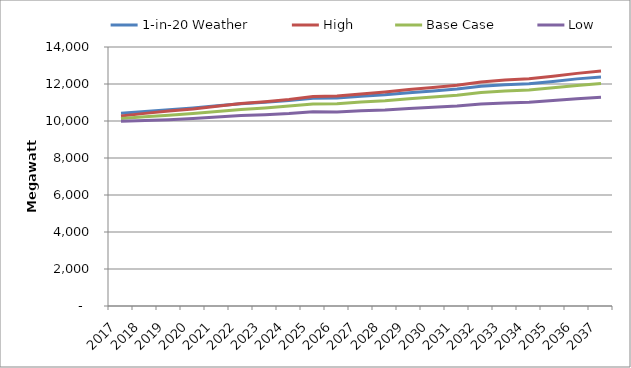
| Category | 1-in-20 Weather | High | Base Case | Low |
|---|---|---|---|---|
| 2017.0 | 10418.772 | 10272.582 | 10129.885 | 9982.24 |
| 2018.0 | 10517.176 | 10412.024 | 10224.713 | 10028.541 |
| 2019.0 | 10605.92 | 10535.82 | 10310.015 | 10069.2 |
| 2020.0 | 10701.734 | 10650.878 | 10403.218 | 10136.416 |
| 2021.0 | 10822.358 | 10799.633 | 10518.418 | 10213.835 |
| 2022.0 | 10930.974 | 10942.516 | 10624.16 | 10291.374 |
| 2023.0 | 11013.038 | 11042.635 | 10706.388 | 10341.916 |
| 2024.0 | 11113.74 | 11164.253 | 10804.439 | 10400.315 |
| 2025.0 | 11231.57 | 11322.64 | 10919.631 | 10494.272 |
| 2026.0 | 11246.189 | 11350.194 | 10931.281 | 10483.987 |
| 2027.0 | 11341.765 | 11459 | 11020.808 | 10557.028 |
| 2028.0 | 11417.41 | 11571.027 | 11096.123 | 10596.737 |
| 2029.0 | 11531.966 | 11697.18 | 11207.37 | 10679.221 |
| 2030.0 | 11623.095 | 11812.762 | 11295.158 | 10741.965 |
| 2031.0 | 11728.286 | 11930.829 | 11397.05 | 10807.202 |
| 2032.0 | 11873.542 | 12108.614 | 11535.765 | 10920.935 |
| 2033.0 | 11963.13 | 12212.053 | 11621.797 | 10970.565 |
| 2034.0 | 12018.041 | 12280.108 | 11676.522 | 11013.719 |
| 2035.0 | 12138.075 | 12422.179 | 11793.029 | 11109.156 |
| 2036.0 | 12276.978 | 12574.463 | 11924.57 | 11202.784 |
| 2037.0 | 12378.067 | 12696.693 | 12026.263 | 11289.603 |